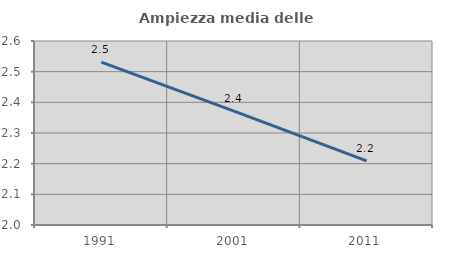
| Category | Ampiezza media delle famiglie |
|---|---|
| 1991.0 | 2.531 |
| 2001.0 | 2.371 |
| 2011.0 | 2.209 |